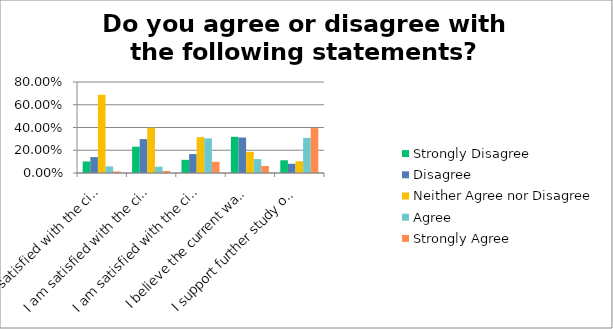
| Category | Strongly Disagree | Disagree | Neither Agree nor Disagree | Agree | Strongly Agree |
|---|---|---|---|---|---|
| I am satisfied with the city’s responsiveness to inquiries and complaints related to snow removal from pedestrian walkways | 0.101 | 0.14 | 0.687 | 0.058 | 0.014 |
| I am satisfied with the city’s enforcement of ordinances related to snow removal from pedestrian walkways | 0.232 | 0.298 | 0.398 | 0.055 | 0.017 |
| I am satisfied with the city’s fine of $50-100 per offense for property owners who repeatedly don’t clear sidewalks in a timely fashion | 0.116 | 0.166 | 0.315 | 0.304 | 0.098 |
| I believe the current way of relying on property owners to keep pedestrian walkways clear in the winter is sufficient | 0.318 | 0.312 | 0.186 | 0.122 | 0.062 |
| I support further study of the cost and feasibility for the City of Ithaca to take over responsibility for snow removal of pedestrian walkways | 0.112 | 0.081 | 0.103 | 0.309 | 0.395 |